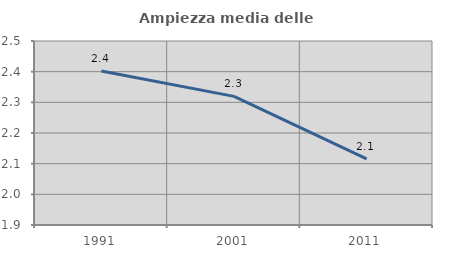
| Category | Ampiezza media delle famiglie |
|---|---|
| 1991.0 | 2.402 |
| 2001.0 | 2.319 |
| 2011.0 | 2.116 |